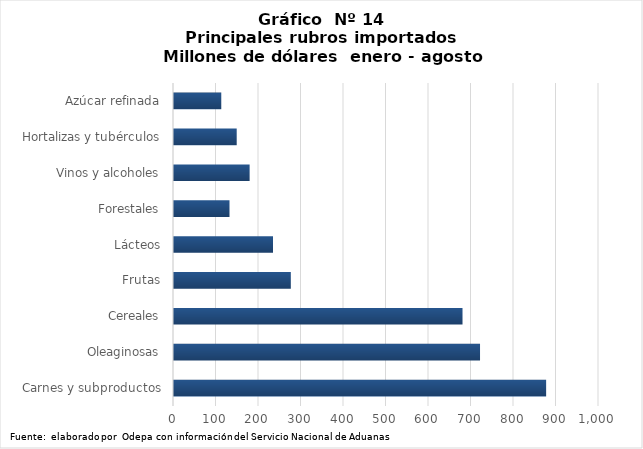
| Category | Series 0 |
|---|---|
| Carnes y subproductos | 875617.756 |
| Oleaginosas | 720078.047 |
| Cereales | 678859.07 |
| Frutas | 274869.142 |
| Lácteos | 232947.677 |
| Forestales | 130583 |
| Vinos y alcoholes | 177936.621 |
| Hortalizas y tubérculos | 147546.132 |
| Azúcar refinada | 111239.139 |